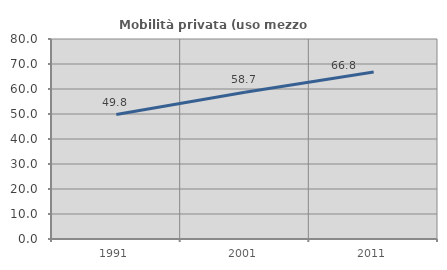
| Category | Mobilità privata (uso mezzo privato) |
|---|---|
| 1991.0 | 49.795 |
| 2001.0 | 58.683 |
| 2011.0 | 66.797 |